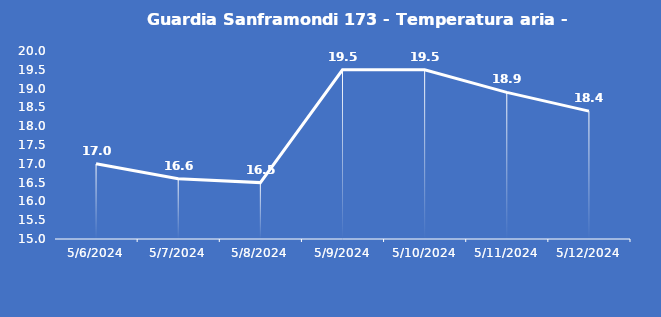
| Category | Guardia Sanframondi 173 - Temperatura aria - Grezzo (°C) |
|---|---|
| 5/6/24 | 17 |
| 5/7/24 | 16.6 |
| 5/8/24 | 16.5 |
| 5/9/24 | 19.5 |
| 5/10/24 | 19.5 |
| 5/11/24 | 18.9 |
| 5/12/24 | 18.4 |